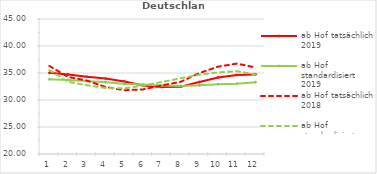
| Category | ab Hof tatsächlich 2019 | ab Hof standardisiert 2019 | ab Hof tatsächlich 2018 | ab Hof standardisiert 2018 |
|---|---|---|---|---|
| 0 | 35.032 | 33.833 | 36.299 | 35.517 |
| 1 | 34.722 | 33.72 | 34.272 | 33.37 |
| 2 | 34.309 | 33.511 | 33.595 | 32.727 |
| 3 | 33.973 | 33.294 | 32.407 | 32.217 |
| 4 | 33.443 | 32.993 | 31.808 | 32.151 |
| 5 | 32.682 | 32.867 | 31.965 | 32.667 |
| 6 | 32.407 | 32.707 | 32.703 | 33.337 |
| 7 | 32.475 | 32.609 | 33.364 | 34.021 |
| 8 | 33.332 | 32.71 | 34.99 | 34.68 |
| 9 | 34.181 | 32.92 | 36.177 | 35.115 |
| 10 | 34.634 | 33.019 | 36.741 | 35.328 |
| 11 | 34.744 | 33.308 | 36.021 | 34.72 |